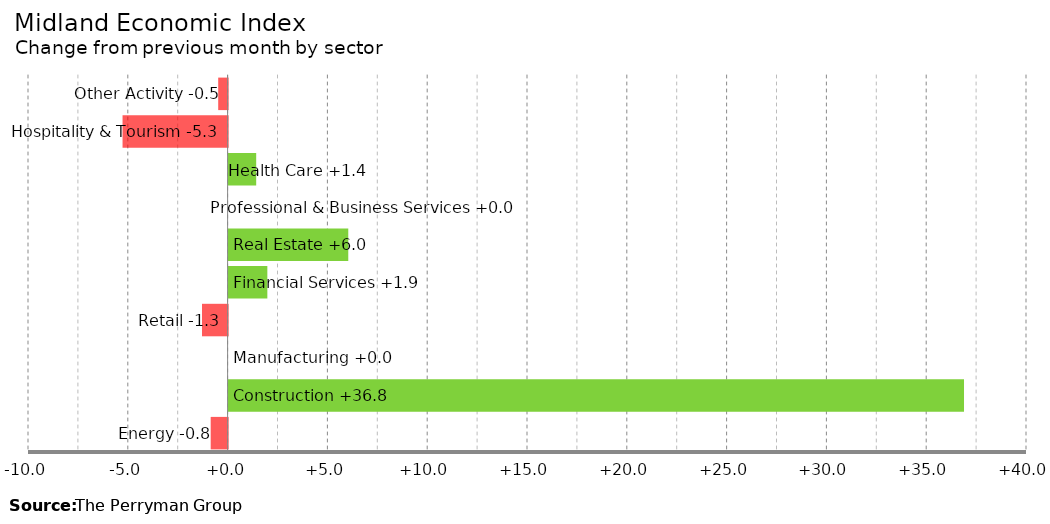
| Category | Change |
|---|---|
| Energy | -0.847 |
| Construction | 36.844 |
| Manufacturing | 0 |
| Retail | -1.283 |
| Financial Services | 1.941 |
| Real Estate | 5.995 |
| Professional & Business Services | 0 |
| Health Care | 1.382 |
| Hospitality & Tourism | -5.263 |
| Other Activity | -0.471 |